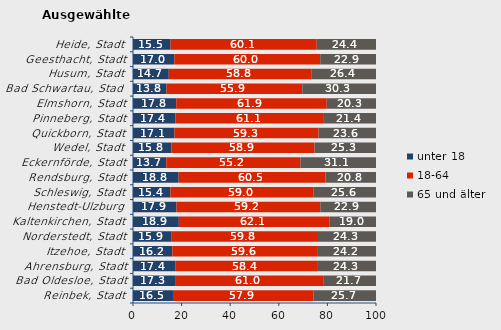
| Category | unter 18 | 18-64 | 65 und älter |
|---|---|---|---|
| Reinbek, Stadt | 16.453 | 57.855 | 25.692 |
| Bad Oldesloe, Stadt | 17.314 | 60.951 | 21.736 |
| Ahrensburg, Stadt | 17.373 | 58.372 | 24.254 |
| Itzehoe, Stadt | 16.194 | 59.567 | 24.239 |
| Norderstedt, Stadt | 15.927 | 59.797 | 24.276 |
| Kaltenkirchen, Stadt | 18.866 | 62.089 | 19.045 |
| Henstedt-Ulzburg | 17.907 | 59.162 | 22.931 |
| Schleswig, Stadt | 15.37 | 59.004 | 25.626 |
| Rendsburg, Stadt | 18.788 | 60.453 | 20.759 |
| Eckernförde, Stadt | 13.69 | 55.234 | 31.076 |
| Wedel, Stadt | 15.83 | 58.857 | 25.313 |
| Quickborn, Stadt | 17.088 | 59.283 | 23.63 |
| Pinneberg, Stadt | 17.422 | 61.138 | 21.44 |
| Elmshorn, Stadt | 17.791 | 61.944 | 20.265 |
| Bad Schwartau, Stadt | 13.785 | 55.875 | 30.341 |
| Husum, Stadt | 14.719 | 58.837 | 26.444 |
| Geesthacht, Stadt | 17.041 | 60.013 | 22.946 |
| Heide, Stadt | 15.467 | 60.149 | 24.384 |